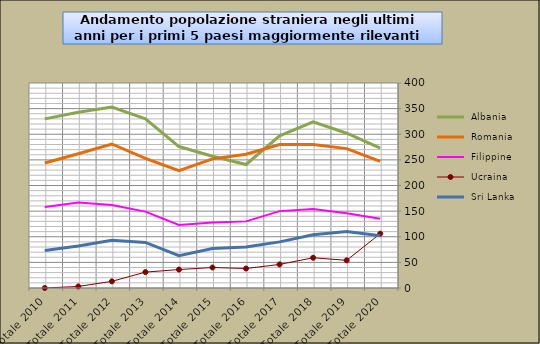
| Category |  Albania  |  Romania  |  Filippine  |  Ucraina  |  Sri Lanka  |
|---|---|---|---|---|---|
| Totale 2020 | 273 | 247 | 135 | 106 | 102 |
| Totale 2019 | 302 | 272 | 146 | 54 | 110 |
| Totale 2018 | 324 | 280 | 154 | 59 | 104 |
| Totale 2017 | 297 | 280 | 150 | 46 | 90 |
| Totale 2016 | 241 | 261 | 130 | 38 | 80 |
| Totale 2015 | 257 | 252 | 128 | 40 | 77 |
| Totale 2014 | 276 | 229 | 123 | 36 | 63 |
| Totale 2013 | 330 | 253 | 149 | 31 | 89 |
| Totale 2012 | 353 | 281 | 162 | 13 | 93 |
| Totale 2011 | 343 | 262 | 167 | 3 | 82 |
| Totale 2010 | 330 | 244 | 158 | 0 | 73 |